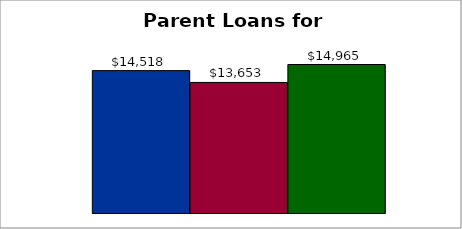
| Category | 50 states and D.C. | SREB states | State |
|---|---|---|---|
| 0 | 14517.688 | 13652.911 | 14965.105 |